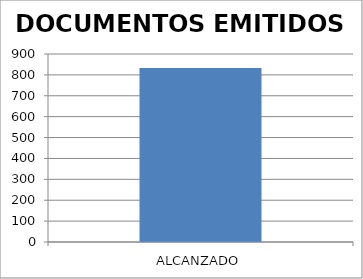
| Category | DOCUMENTOS EMITIDOS |
|---|---|
| ALCANZADO | 833 |